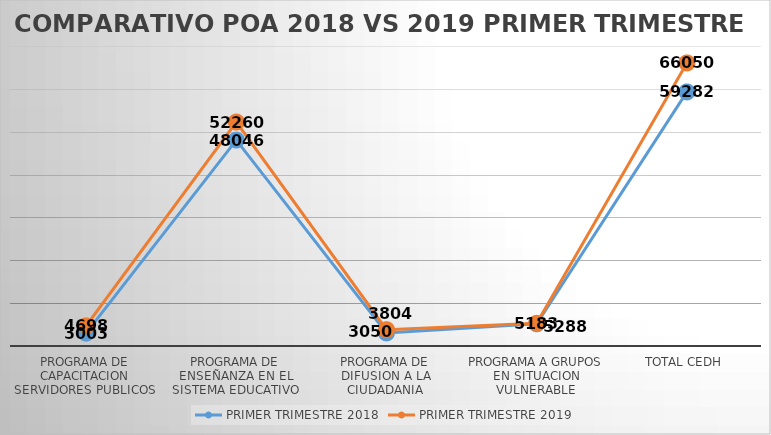
| Category | PRIMER TRIMESTRE 2018 | PRIMER TRIMESTRE 2019 |
|---|---|---|
| PROGRAMA DE CAPACITACION SERVIDORES PUBLICOS | 3003 | 4698 |
| PROGRAMA DE ENSEÑANZA EN EL SISTEMA EDUCATIVO | 48046 | 52260 |
| PROGRAMA DE DIFUSION A LA CIUDADANIA | 3050 | 3804 |
| PROGRAMA A GRUPOS EN SITUACION VULNERABLE | 5183 | 5288 |
| TOTAL CEDH | 59282 | 66050 |